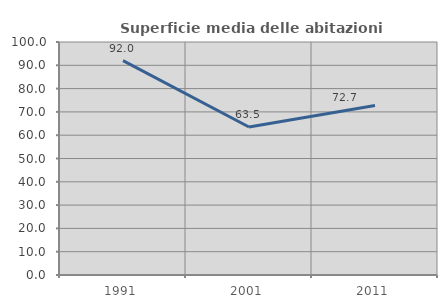
| Category | Superficie media delle abitazioni occupate |
|---|---|
| 1991.0 | 92 |
| 2001.0 | 63.532 |
| 2011.0 | 72.709 |